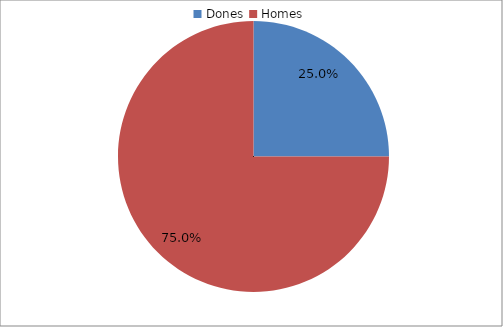
| Category | Series 0 |
|---|---|
| Dones | 0.25 |
| Homes | 0.75 |